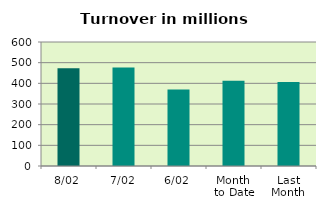
| Category | Series 0 |
|---|---|
| 8/02 | 472.963 |
| 7/02 | 476.751 |
| 6/02 | 370.122 |
| Month 
to Date | 412.384 |
| Last
Month | 406.6 |